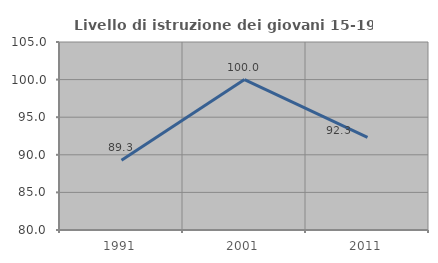
| Category | Livello di istruzione dei giovani 15-19 anni |
|---|---|
| 1991.0 | 89.286 |
| 2001.0 | 100 |
| 2011.0 | 92.308 |